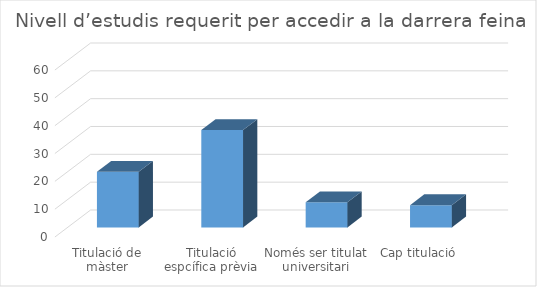
| Category | Series 0 |
|---|---|
| Titulació de màster | 20 |
| Titulació espcífica prèvia | 35 |
| Només ser titulat universitari | 9 |
| Cap titulació | 8 |